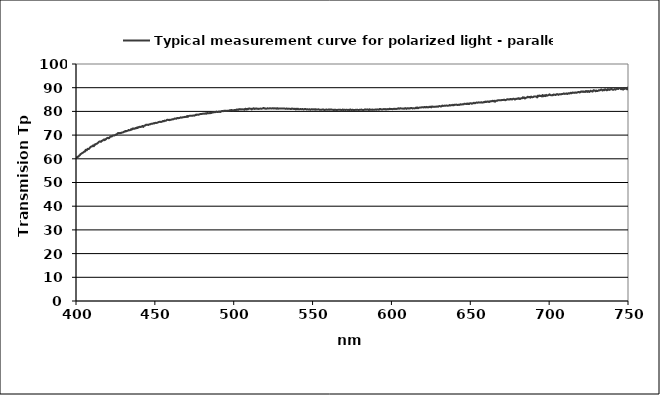
| Category | Typical measurement curve for polarized light - parallel |
|---|---|
| 400.049564 | 60.288 |
| 400.452562 | 60.652 |
| 400.85561 | 60.528 |
| 401.258708 | 60.937 |
| 401.661857 | 60.959 |
| 402.065055 | 61.422 |
| 402.468304 | 61.537 |
| 402.871603 | 61.982 |
| 403.274952 | 62.123 |
| 403.678352 | 62.305 |
| 404.081801 | 62.485 |
| 404.485301 | 62.629 |
| 404.88885 | 62.859 |
| 405.29245 | 63.039 |
| 405.6961 | 63.07 |
| 406.099799 | 63.736 |
| 406.503549 | 63.733 |
| 406.907349 | 63.632 |
| 407.311198 | 64.171 |
| 407.715098 | 64.172 |
| 408.119047 | 64.128 |
| 408.523046 | 64.419 |
| 408.927096 | 64.762 |
| 409.331194 | 65.077 |
| 409.735343 | 65.137 |
| 410.139542 | 65.228 |
| 410.54379 | 65.519 |
| 410.948088 | 65.592 |
| 411.352436 | 65.322 |
| 411.756834 | 65.987 |
| 412.161281 | 65.905 |
| 412.565778 | 66.226 |
| 412.970324 | 66.324 |
| 413.374921 | 66.407 |
| 413.779567 | 66.679 |
| 414.184262 | 66.868 |
| 414.589007 | 67.199 |
| 414.993801 | 67.312 |
| 415.398646 | 67.334 |
| 415.803539 | 67.125 |
| 416.208482 | 67.554 |
| 416.613475 | 67.594 |
| 417.018517 | 67.784 |
| 417.423608 | 68.06 |
| 417.828749 | 68.138 |
| 418.233939 | 67.862 |
| 418.639179 | 68.262 |
| 419.044468 | 68.249 |
| 419.449806 | 68.671 |
| 419.855194 | 68.743 |
| 420.26063 | 68.866 |
| 420.666116 | 68.646 |
| 421.071652 | 68.798 |
| 421.477236 | 69.134 |
| 421.88287 | 69.349 |
| 422.288553 | 69.566 |
| 422.694285 | 69.42 |
| 423.100067 | 69.688 |
| 423.505897 | 69.794 |
| 423.911777 | 69.777 |
| 424.317705 | 69.829 |
| 424.723683 | 69.995 |
| 425.129709 | 70.013 |
| 425.535785 | 70.312 |
| 425.94191 | 70.313 |
| 426.348084 | 70.626 |
| 426.754306 | 70.895 |
| 427.160578 | 70.733 |
| 427.566898 | 70.828 |
| 427.973268 | 70.948 |
| 428.379686 | 70.815 |
| 428.786153 | 70.991 |
| 429.192669 | 71.086 |
| 429.599234 | 71.1 |
| 430.005848 | 71.242 |
| 430.41251 | 71.427 |
| 430.819221 | 71.405 |
| 431.225981 | 71.759 |
| 431.63279 | 71.559 |
| 432.039647 | 71.742 |
| 432.446553 | 71.778 |
| 432.853508 | 71.844 |
| 433.260511 | 72.131 |
| 433.667563 | 72.004 |
| 434.074663 | 72.043 |
| 434.481812 | 72.173 |
| 434.88901 | 72.478 |
| 435.296256 | 72.264 |
| 435.703551 | 72.756 |
| 436.110894 | 72.552 |
| 436.518286 | 72.805 |
| 436.925726 | 72.717 |
| 437.333214 | 72.705 |
| 437.740751 | 72.969 |
| 438.148337 | 72.87 |
| 438.55597 | 73.159 |
| 438.963652 | 72.976 |
| 439.371383 | 73.376 |
| 439.779162 | 73.229 |
| 440.186989 | 73.437 |
| 440.594864 | 73.516 |
| 441.002788 | 73.383 |
| 441.410759 | 73.512 |
| 441.818779 | 73.682 |
| 442.226848 | 73.836 |
| 442.634964 | 73.412 |
| 443.043129 | 73.834 |
| 443.451341 | 74.002 |
| 443.859602 | 74.017 |
| 444.267911 | 74.323 |
| 444.676268 | 74.308 |
| 445.084673 | 74.354 |
| 445.493126 | 74.371 |
| 445.901627 | 74.258 |
| 446.310176 | 74.472 |
| 446.718773 | 74.568 |
| 447.127418 | 74.554 |
| 447.536111 | 74.737 |
| 447.944852 | 74.763 |
| 448.353641 | 74.757 |
| 448.762477 | 74.865 |
| 449.171362 | 74.983 |
| 449.580294 | 74.934 |
| 449.989274 | 75.126 |
| 450.398302 | 75.176 |
| 450.807378 | 75.082 |
| 451.216501 | 75.175 |
| 451.625672 | 75.252 |
| 452.034891 | 75.408 |
| 452.444158 | 75.506 |
| 452.853472 | 75.566 |
| 453.262834 | 75.662 |
| 453.672244 | 75.529 |
| 454.081701 | 75.561 |
| 454.491206 | 75.675 |
| 454.900758 | 75.88 |
| 455.310358 | 75.907 |
| 455.720005 | 75.82 |
| 456.1297 | 76.104 |
| 456.539443 | 76.078 |
| 456.949233 | 76.045 |
| 457.35907 | 76.234 |
| 457.768955 | 76.446 |
| 458.178887 | 76.441 |
| 458.588867 | 76.377 |
| 458.998894 | 76.498 |
| 459.408969 | 76.296 |
| 459.81909 | 76.423 |
| 460.229259 | 76.483 |
| 460.639476 | 76.623 |
| 461.049739 | 76.62 |
| 461.46005 | 76.742 |
| 461.870408 | 76.669 |
| 462.280814 | 76.902 |
| 462.691266 | 76.999 |
| 463.101766 | 76.957 |
| 463.512313 | 76.885 |
| 463.922907 | 77.14 |
| 464.333548 | 77.218 |
| 464.744236 | 77.093 |
| 465.154972 | 77.208 |
| 465.565754 | 77.197 |
| 465.976583 | 77.324 |
| 466.38746 | 77.491 |
| 466.798383 | 77.389 |
| 467.209354 | 77.37 |
| 467.620371 | 77.526 |
| 468.031436 | 77.59 |
| 468.442547 | 77.556 |
| 468.853705 | 77.659 |
| 469.26491 | 77.707 |
| 469.676162 | 77.648 |
| 470.087461 | 77.74 |
| 470.498806 | 78.077 |
| 470.910199 | 77.666 |
| 471.321638 | 77.991 |
| 471.733124 | 78.102 |
| 472.144657 | 78.126 |
| 472.556236 | 78.161 |
| 472.967862 | 78.169 |
| 473.379535 | 78.215 |
| 473.791255 | 78.144 |
| 474.203021 | 78.253 |
| 474.614833 | 78.24 |
| 475.026693 | 78.2 |
| 475.438599 | 78.351 |
| 475.850551 | 78.582 |
| 476.26255 | 78.496 |
| 476.674596 | 78.684 |
| 477.086688 | 78.62 |
| 477.498827 | 78.53 |
| 477.911012 | 78.716 |
| 478.323243 | 78.739 |
| 478.735521 | 78.876 |
| 479.147845 | 78.856 |
| 479.560216 | 78.879 |
| 479.972633 | 78.985 |
| 480.385097 | 79.058 |
| 480.797607 | 79.045 |
| 481.210163 | 79.121 |
| 481.622765 | 79.004 |
| 482.035414 | 79.073 |
| 482.448109 | 79.281 |
| 482.86085 | 78.999 |
| 483.273637 | 79.298 |
| 483.686471 | 79.269 |
| 484.099351 | 79.242 |
| 484.512277 | 79.31 |
| 484.925249 | 79.213 |
| 485.338267 | 79.335 |
| 485.751331 | 79.315 |
| 486.164441 | 79.491 |
| 486.577598 | 79.505 |
| 486.9908 | 79.578 |
| 487.404049 | 79.599 |
| 487.817343 | 79.705 |
| 488.230683 | 79.679 |
| 488.64407 | 79.734 |
| 489.057502 | 79.934 |
| 489.47098 | 79.76 |
| 489.884504 | 79.775 |
| 490.298074 | 79.807 |
| 490.71169 | 79.975 |
| 491.125352 | 79.816 |
| 491.53906 | 79.746 |
| 491.952813 | 80.02 |
| 492.366612 | 80.103 |
| 492.780457 | 80.192 |
| 493.194348 | 80.088 |
| 493.608284 | 80.167 |
| 494.022266 | 80.316 |
| 494.436294 | 80.149 |
| 494.850367 | 80.273 |
| 495.264486 | 80.182 |
| 495.678651 | 80.257 |
| 496.092861 | 80.238 |
| 496.507117 | 80.304 |
| 496.921418 | 80.275 |
| 497.335765 | 80.467 |
| 497.750158 | 80.427 |
| 498.164596 | 80.524 |
| 498.57908 | 80.609 |
| 498.993609 | 80.492 |
| 499.408183 | 80.441 |
| 499.822803 | 80.471 |
| 500.237468 | 80.536 |
| 500.652179 | 80.618 |
| 501.066935 | 80.573 |
| 501.481736 | 80.544 |
| 501.896583 | 80.816 |
| 502.311475 | 80.812 |
| 502.726412 | 80.58 |
| 503.141395 | 80.848 |
| 503.556423 | 80.964 |
| 503.971496 | 80.77 |
| 504.386614 | 80.956 |
| 504.801778 | 80.796 |
| 505.216986 | 80.913 |
| 505.63224 | 80.852 |
| 506.047539 | 80.778 |
| 506.462883 | 80.887 |
| 506.878272 | 80.695 |
| 507.293706 | 81.089 |
| 507.709186 | 81.029 |
| 508.12471 | 80.755 |
| 508.540279 | 81.084 |
| 508.955894 | 80.865 |
| 509.371553 | 81.091 |
| 509.787257 | 81.272 |
| 510.203007 | 81.138 |
| 510.618801 | 81.146 |
| 511.03464 | 81.136 |
| 511.450524 | 80.813 |
| 511.866453 | 81.117 |
| 512.282426 | 81.148 |
| 512.698445 | 81.346 |
| 513.114508 | 81.058 |
| 513.530616 | 81.056 |
| 513.946769 | 81.208 |
| 514.362967 | 81.271 |
| 514.779209 | 81.066 |
| 515.195496 | 81.183 |
| 515.611828 | 81.011 |
| 516.028204 | 81.159 |
| 516.444625 | 81.085 |
| 516.861091 | 81.19 |
| 517.277601 | 81.153 |
| 517.694156 | 81.092 |
| 518.110755 | 81.228 |
| 518.527399 | 81.318 |
| 518.944088 | 81.426 |
| 519.360821 | 81.229 |
| 519.777598 | 81.292 |
| 520.19442 | 81.155 |
| 520.611286 | 81.164 |
| 521.028197 | 81.181 |
| 521.445153 | 81.319 |
| 521.862152 | 81.187 |
| 522.279196 | 81.19 |
| 522.696285 | 81.277 |
| 523.113417 | 81.341 |
| 523.530594 | 81.244 |
| 523.947816 | 81.174 |
| 524.365081 | 81.293 |
| 524.782391 | 81.312 |
| 525.199745 | 81.214 |
| 525.617143 | 81.357 |
| 526.034586 | 81.238 |
| 526.452073 | 81.173 |
| 526.869604 | 81.343 |
| 527.287178 | 81.103 |
| 527.704798 | 81.336 |
| 528.122461 | 81.128 |
| 528.540168 | 81.193 |
| 528.957919 | 81.18 |
| 529.375715 | 81.274 |
| 529.793554 | 81.254 |
| 530.211438 | 81.244 |
| 530.629365 | 81.231 |
| 531.047336 | 81.258 |
| 531.465352 | 81.207 |
| 531.883411 | 81.192 |
| 532.301514 | 81.191 |
| 532.719661 | 81.11 |
| 533.137852 | 81.065 |
| 533.556087 | 81.229 |
| 533.974365 | 81.154 |
| 534.392687 | 81.057 |
| 534.811054 | 81.175 |
| 535.229463 | 81.124 |
| 535.647917 | 81.113 |
| 536.066414 | 80.985 |
| 536.484956 | 81.013 |
| 536.90354 | 81.21 |
| 537.322169 | 81.115 |
| 537.740841 | 81.134 |
| 538.159557 | 80.962 |
| 538.578316 | 81.096 |
| 538.997119 | 81.074 |
| 539.415965 | 80.816 |
| 539.834855 | 81.116 |
| 540.253789 | 80.901 |
| 540.672766 | 81.164 |
| 541.091787 | 80.906 |
| 541.510851 | 80.951 |
| 541.929958 | 80.939 |
| 542.349109 | 81 |
| 542.768303 | 80.942 |
| 543.187541 | 80.935 |
| 543.606822 | 81.029 |
| 544.026147 | 80.881 |
| 544.445515 | 80.792 |
| 544.864926 | 80.973 |
| 545.28438 | 80.974 |
| 545.703878 | 80.997 |
| 546.123419 | 80.782 |
| 546.543003 | 80.86 |
| 546.96263 | 80.904 |
| 547.382301 | 80.754 |
| 547.802015 | 80.858 |
| 548.221772 | 80.87 |
| 548.641572 | 80.672 |
| 549.061415 | 80.818 |
| 549.481301 | 80.925 |
| 549.901231 | 80.805 |
| 550.321203 | 80.911 |
| 550.741219 | 80.815 |
| 551.161277 | 80.744 |
| 551.581379 | 80.97 |
| 552.001523 | 80.682 |
| 552.421711 | 80.862 |
| 552.841941 | 80.782 |
| 553.262214 | 80.822 |
| 553.682531 | 80.873 |
| 554.10289 | 80.786 |
| 554.523292 | 80.681 |
| 554.943736 | 80.709 |
| 555.364224 | 80.702 |
| 555.784755 | 80.695 |
| 556.205328 | 80.818 |
| 556.625944 | 80.796 |
| 557.046603 | 80.83 |
| 557.467304 | 80.511 |
| 557.888048 | 80.617 |
| 558.308835 | 80.698 |
| 558.729665 | 80.818 |
| 559.150537 | 80.681 |
| 559.571452 | 80.706 |
| 559.992409 | 80.685 |
| 560.413409 | 80.872 |
| 560.834451 | 80.673 |
| 561.255537 | 80.765 |
| 561.676664 | 80.85 |
| 562.097834 | 80.77 |
| 562.519047 | 80.649 |
| 562.940302 | 80.712 |
| 563.3616 | 80.577 |
| 563.78294 | 80.729 |
| 564.204322 | 80.603 |
| 564.625747 | 80.693 |
| 565.047214 | 80.63 |
| 565.468724 | 80.585 |
| 565.890275 | 80.65 |
| 566.31187 | 80.72 |
| 566.733506 | 80.705 |
| 567.155185 | 80.742 |
| 567.576906 | 80.692 |
| 567.998669 | 80.627 |
| 568.420474 | 80.467 |
| 568.842322 | 80.732 |
| 569.264212 | 80.752 |
| 569.686144 | 80.525 |
| 570.108118 | 80.738 |
| 570.530134 | 80.651 |
| 570.952192 | 80.6 |
| 571.374292 | 80.682 |
| 571.796435 | 80.666 |
| 572.218619 | 80.62 |
| 572.640846 | 80.589 |
| 573.063114 | 80.68 |
| 573.485424 | 80.615 |
| 573.907777 | 80.837 |
| 574.330171 | 80.66 |
| 574.752607 | 80.558 |
| 575.175085 | 80.691 |
| 575.597605 | 80.684 |
| 576.020167 | 80.541 |
| 576.442771 | 80.635 |
| 576.865416 | 80.603 |
| 577.288104 | 80.667 |
| 577.710833 | 80.634 |
| 578.133604 | 80.703 |
| 578.556416 | 80.665 |
| 578.97927 | 80.612 |
| 579.402166 | 80.583 |
| 579.825104 | 80.73 |
| 580.248083 | 80.675 |
| 580.671104 | 80.678 |
| 581.094167 | 80.768 |
| 581.517271 | 80.645 |
| 581.940417 | 80.585 |
| 582.363604 | 80.569 |
| 582.786833 | 80.673 |
| 583.210103 | 80.88 |
| 583.633415 | 80.73 |
| 584.056768 | 80.799 |
| 584.480163 | 80.654 |
| 584.903599 | 80.853 |
| 585.327077 | 80.752 |
| 585.750596 | 80.552 |
| 586.174156 | 80.876 |
| 586.597758 | 80.698 |
| 587.021401 | 80.644 |
| 587.445086 | 80.685 |
| 587.868811 | 80.815 |
| 588.292578 | 80.638 |
| 588.716386 | 80.721 |
| 589.140236 | 80.714 |
| 589.564127 | 80.753 |
| 589.988059 | 80.765 |
| 590.412032 | 80.671 |
| 590.836046 | 80.858 |
| 591.260101 | 80.794 |
| 591.684198 | 80.797 |
| 592.108335 | 80.691 |
| 592.532514 | 80.984 |
| 592.956734 | 81.023 |
| 593.380994 | 80.821 |
| 593.805296 | 80.862 |
| 594.229639 | 80.772 |
| 594.654022 | 80.927 |
| 595.078447 | 80.97 |
| 595.502913 | 80.858 |
| 595.927419 | 81.037 |
| 596.351967 | 80.816 |
| 596.776555 | 80.901 |
| 597.201184 | 80.828 |
| 597.625854 | 80.984 |
| 598.050565 | 80.936 |
| 598.475317 | 80.934 |
| 598.900109 | 81.138 |
| 599.324942 | 80.987 |
| 599.749816 | 80.967 |
| 600.174731 | 80.998 |
| 600.599686 | 80.931 |
| 601.024682 | 81.014 |
| 601.449718 | 81.065 |
| 601.874796 | 81.08 |
| 602.299914 | 80.974 |
| 602.725072 | 81.072 |
| 603.150271 | 81.058 |
| 603.575511 | 81.064 |
| 604.000791 | 81.201 |
| 604.426111 | 81.304 |
| 604.851472 | 81.085 |
| 605.276874 | 81.226 |
| 605.702316 | 81.32 |
| 606.127798 | 81.199 |
| 606.553321 | 81.169 |
| 606.978885 | 81.184 |
| 607.404488 | 81.12 |
| 607.830132 | 81.218 |
| 608.255817 | 81.121 |
| 608.681541 | 81.385 |
| 609.107306 | 81.308 |
| 609.533111 | 81.062 |
| 609.958957 | 81.259 |
| 610.384842 | 81.36 |
| 610.810768 | 81.241 |
| 611.236734 | 81.314 |
| 611.66274 | 81.187 |
| 612.088787 | 81.409 |
| 612.514873 | 81.473 |
| 612.941 | 81.345 |
| 613.367167 | 81.235 |
| 613.793373 | 81.38 |
| 614.21962 | 81.344 |
| 614.645907 | 81.268 |
| 615.072234 | 81.298 |
| 615.498601 | 81.555 |
| 615.925007 | 81.354 |
| 616.351454 | 81.678 |
| 616.777941 | 81.316 |
| 617.204467 | 81.489 |
| 617.631034 | 81.57 |
| 618.05764 | 81.656 |
| 618.484286 | 81.628 |
| 618.910972 | 81.703 |
| 619.337698 | 81.689 |
| 619.764463 | 81.785 |
| 620.191269 | 81.753 |
| 620.618114 | 81.647 |
| 621.044998 | 81.888 |
| 621.471923 | 81.78 |
| 621.898887 | 81.652 |
| 622.325891 | 81.912 |
| 622.752934 | 81.768 |
| 623.180017 | 81.686 |
| 623.60714 | 81.765 |
| 624.034302 | 81.963 |
| 624.461504 | 81.779 |
| 624.888745 | 81.988 |
| 625.316026 | 81.687 |
| 625.743346 | 82.072 |
| 626.170706 | 81.94 |
| 626.598105 | 81.948 |
| 627.025544 | 81.904 |
| 627.453022 | 81.999 |
| 627.880539 | 81.947 |
| 628.308096 | 82.029 |
| 628.735692 | 81.987 |
| 629.163328 | 82.074 |
| 629.591002 | 81.969 |
| 630.018716 | 82.164 |
| 630.44647 | 82.242 |
| 630.874262 | 82.193 |
| 631.302094 | 82.078 |
| 631.729965 | 82.146 |
| 632.157875 | 82.453 |
| 632.585825 | 82.301 |
| 633.013813 | 82.328 |
| 633.441841 | 82.364 |
| 633.869907 | 82.456 |
| 634.298013 | 82.334 |
| 634.726158 | 82.467 |
| 635.154342 | 82.454 |
| 635.582565 | 82.414 |
| 636.010827 | 82.41 |
| 636.439127 | 82.486 |
| 636.867467 | 82.689 |
| 637.295846 | 82.495 |
| 637.724264 | 82.621 |
| 638.15272 | 82.649 |
| 638.581216 | 82.574 |
| 639.00975 | 82.792 |
| 639.438323 | 82.551 |
| 639.866935 | 82.759 |
| 640.295585 | 82.803 |
| 640.724275 | 82.794 |
| 641.153003 | 82.873 |
| 641.58177 | 82.778 |
| 642.010576 | 82.668 |
| 642.43942 | 82.807 |
| 642.868303 | 82.722 |
| 643.297225 | 82.794 |
| 643.726185 | 83.046 |
| 644.155184 | 82.888 |
| 644.584221 | 82.873 |
| 645.013297 | 83.053 |
| 645.442411 | 82.969 |
| 645.871564 | 82.992 |
| 646.300756 | 83.273 |
| 646.729986 | 83.196 |
| 647.159254 | 83.16 |
| 647.588561 | 83.116 |
| 648.017906 | 83.353 |
| 648.44729 | 83.085 |
| 648.876712 | 83.32 |
| 649.306172 | 83.09 |
| 649.735671 | 83.408 |
| 650.165208 | 83.409 |
| 650.594783 | 83.4 |
| 651.024397 | 83.196 |
| 651.454049 | 83.421 |
| 651.883739 | 83.407 |
| 652.313467 | 83.663 |
| 652.743233 | 83.443 |
| 653.173038 | 83.492 |
| 653.60288 | 83.621 |
| 654.032761 | 83.752 |
| 654.46268 | 83.682 |
| 654.892637 | 83.717 |
| 655.322632 | 83.821 |
| 655.752665 | 83.709 |
| 656.182736 | 83.766 |
| 656.612845 | 83.756 |
| 657.042992 | 83.89 |
| 657.473177 | 83.697 |
| 657.9034 | 83.785 |
| 658.333661 | 83.799 |
| 658.763959 | 84.032 |
| 659.194296 | 83.884 |
| 659.62467 | 84.148 |
| 660.055082 | 83.959 |
| 660.485532 | 84.122 |
| 660.91602 | 84.165 |
| 661.346545 | 83.993 |
| 661.777108 | 84.213 |
| 662.207709 | 83.971 |
| 662.638348 | 84.283 |
| 663.069024 | 84.32 |
| 663.499738 | 84.256 |
| 663.930489 | 84.469 |
| 664.361278 | 84.339 |
| 664.792105 | 84.309 |
| 665.222969 | 84.509 |
| 665.653871 | 84.051 |
| 666.084811 | 84.352 |
| 666.515787 | 84.557 |
| 666.946802 | 84.45 |
| 667.377853 | 84.665 |
| 667.808942 | 84.716 |
| 668.240069 | 84.735 |
| 668.671233 | 84.717 |
| 669.102434 | 84.707 |
| 669.533673 | 84.676 |
| 669.964949 | 84.844 |
| 670.396262 | 84.846 |
| 670.827613 | 84.773 |
| 671.259001 | 84.923 |
| 671.690426 | 84.915 |
| 672.121888 | 84.713 |
| 672.553387 | 84.851 |
| 672.984924 | 84.883 |
| 673.416498 | 85.152 |
| 673.848109 | 85.109 |
| 674.279757 | 84.981 |
| 674.711442 | 85.144 |
| 675.143164 | 84.979 |
| 675.574923 | 85.273 |
| 676.006719 | 85.192 |
| 676.438553 | 85.009 |
| 676.870423 | 85.224 |
| 677.30233 | 85.358 |
| 677.734274 | 85.314 |
| 678.166255 | 85.025 |
| 678.598273 | 85.108 |
| 679.030328 | 85.365 |
| 679.462419 | 85.269 |
| 679.894548 | 85.423 |
| 680.326713 | 85.313 |
| 680.758915 | 85.595 |
| 681.191154 | 85.28 |
| 681.623429 | 85.269 |
| 682.055741 | 85.489 |
| 682.48809 | 85.544 |
| 682.920476 | 85.527 |
| 683.352898 | 85.973 |
| 683.785357 | 85.651 |
| 684.217852 | 85.893 |
| 684.650384 | 85.408 |
| 685.082953 | 85.673 |
| 685.515558 | 85.813 |
| 685.9482 | 85.864 |
| 686.380878 | 86.181 |
| 686.813592 | 86.062 |
| 687.246343 | 85.929 |
| 687.679131 | 86.108 |
| 688.111955 | 85.783 |
| 688.544815 | 86.244 |
| 688.977712 | 86.072 |
| 689.410645 | 85.958 |
| 689.843614 | 86.063 |
| 690.276619 | 86.253 |
| 690.709661 | 86.276 |
| 691.142739 | 86.319 |
| 691.575854 | 86.25 |
| 692.009004 | 86.247 |
| 692.442191 | 85.899 |
| 692.875414 | 86.628 |
| 693.308673 | 86.392 |
| 693.741968 | 86.69 |
| 694.175299 | 86.55 |
| 694.608667 | 86.492 |
| 695.04207 | 86.639 |
| 695.475509 | 86.288 |
| 695.908985 | 86.908 |
| 696.342496 | 86.458 |
| 696.776043 | 86.481 |
| 697.209627 | 86.803 |
| 697.643246 | 86.442 |
| 698.076901 | 86.977 |
| 698.510592 | 86.622 |
| 698.944319 | 86.722 |
| 699.378081 | 86.813 |
| 699.81188 | 86.917 |
| 700.245714 | 87.224 |
| 700.679584 | 86.918 |
| 701.11349 | 86.844 |
| 701.547431 | 86.809 |
| 701.981408 | 86.886 |
| 702.415421 | 86.834 |
| 702.84947 | 87.13 |
| 703.283554 | 86.986 |
| 703.717673 | 87.025 |
| 704.151829 | 86.913 |
| 704.58602 | 87.138 |
| 705.020246 | 87.303 |
| 705.454508 | 87.209 |
| 705.888805 | 86.965 |
| 706.323138 | 87.222 |
| 706.757506 | 87.219 |
| 707.19191 | 87.22 |
| 707.626349 | 87.18 |
| 708.060823 | 87.39 |
| 708.495333 | 87.296 |
| 708.929878 | 87.465 |
| 709.364459 | 87.598 |
| 709.799075 | 87.395 |
| 710.233726 | 87.412 |
| 710.668412 | 87.446 |
| 711.103133 | 87.611 |
| 711.53789 | 87.348 |
| 711.972682 | 87.584 |
| 712.407509 | 87.698 |
| 712.842371 | 87.5 |
| 713.277268 | 87.701 |
| 713.712201 | 87.886 |
| 714.147168 | 87.629 |
| 714.58217 | 87.81 |
| 715.017208 | 87.971 |
| 715.45228 | 87.835 |
| 715.887387 | 87.936 |
| 716.32253 | 87.809 |
| 716.757707 | 87.98 |
| 717.192919 | 87.852 |
| 717.628166 | 87.971 |
| 718.063448 | 88.042 |
| 718.498765 | 88.186 |
| 718.934116 | 88.171 |
| 719.369502 | 87.967 |
| 719.804923 | 88.167 |
| 720.240379 | 88.413 |
| 720.67587 | 88.257 |
| 721.111395 | 88.44 |
| 721.546955 | 88.2 |
| 721.982549 | 88.451 |
| 722.418178 | 88.247 |
| 722.853842 | 88.203 |
| 723.28954 | 88.577 |
| 723.725273 | 88.467 |
| 724.16104 | 88.225 |
| 724.596842 | 88.591 |
| 725.032679 | 88.481 |
| 725.468549 | 88.169 |
| 725.904455 | 88.53 |
| 726.340394 | 88.733 |
| 726.776368 | 88.489 |
| 727.212377 | 88.468 |
| 727.648419 | 88.357 |
| 728.084496 | 88.926 |
| 728.520608 | 88.832 |
| 728.956753 | 88.777 |
| 729.392933 | 88.49 |
| 729.829147 | 88.833 |
| 730.265396 | 88.585 |
| 730.701678 | 88.616 |
| 731.137995 | 88.773 |
| 731.574345 | 88.947 |
| 732.01073 | 88.835 |
| 732.447149 | 88.991 |
| 732.883602 | 89.206 |
| 733.320089 | 89.194 |
| 733.75661 | 88.814 |
| 734.193166 | 88.902 |
| 734.629755 | 89.164 |
| 735.066377 | 88.942 |
| 735.503034 | 89.372 |
| 735.939725 | 89.181 |
| 736.37645 | 88.906 |
| 736.813208 | 88.939 |
| 737.250001 | 89.419 |
| 737.686827 | 89.245 |
| 738.123687 | 89.043 |
| 738.56058 | 89.398 |
| 738.997508 | 89.271 |
| 739.434469 | 89.58 |
| 739.871464 | 89.374 |
| 740.308492 | 89.104 |
| 740.745554 | 89.117 |
| 741.18265 | 89.298 |
| 741.619779 | 89.404 |
| 742.056942 | 89.164 |
| 742.494138 | 89.464 |
| 742.931368 | 89.573 |
| 743.368632 | 89.607 |
| 743.805928 | 89.402 |
| 744.243259 | 89.73 |
| 744.680622 | 89.832 |
| 745.11802 | 89.781 |
| 745.55545 | 89.373 |
| 745.992914 | 89.509 |
| 746.430411 | 89.823 |
| 746.867942 | 89.167 |
| 747.305505 | 89.565 |
| 747.743102 | 89.485 |
| 748.180732 | 89.559 |
| 748.618396 | 89.693 |
| 749.056092 | 89.64 |
| 749.493822 | 89.317 |
| 749.931585 | 90.081 |
| 750.369381 | 89.531 |